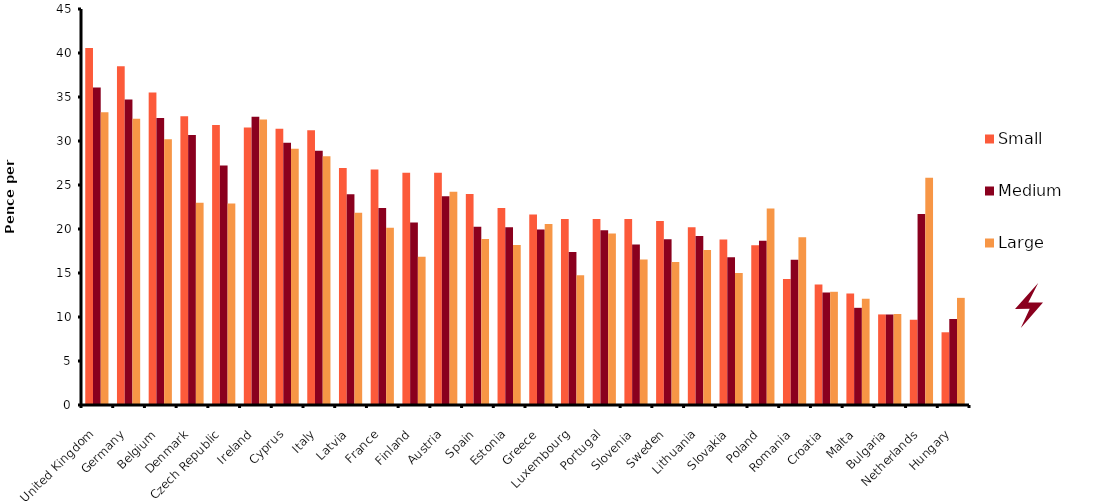
| Category | Small | Medium | Large |
|---|---|---|---|
| United Kingdom | 40.568 | 36.07 | 33.265 |
| Germany | 38.494 | 34.712 | 32.527 |
| Belgium | 35.497 | 32.622 | 30.187 |
| Denmark | 32.821 | 30.688 | 22.977 |
| Czech Republic | 31.819 | 27.208 | 22.891 |
| Ireland | 31.543 | 32.76 | 32.441 |
| Cyprus | 31.387 | 29.807 | 29.116 |
| Italy | 31.223 | 28.9 | 28.27 |
| Latvia | 26.923 | 23.953 | 21.846 |
| France | 26.75 | 22.373 | 20.145 |
| Finland | 26.388 | 20.749 | 16.846 |
| Austria | 26.379 | 23.728 | 24.246 |
| Spain | 23.97 | 20.266 | 18.85 |
| Estonia | 22.373 | 20.197 | 18.176 |
| Greece | 21.639 | 19.938 | 20.559 |
| Luxembourg | 21.138 | 17.399 | 14.731 |
| Portugal | 21.129 | 19.851 | 19.489 |
| Slovenia | 21.129 | 18.245 | 16.527 |
| Sweden | 20.905 | 18.832 | 16.259 |
| Lithuania | 20.197 | 19.195 | 17.606 |
| Slovakia | 18.806 | 16.777 | 15.007 |
| Poland | 18.15 | 18.668 | 22.321 |
| Romania | 14.325 | 16.492 | 19.074 |
| Croatia | 13.703 | 12.779 | 12.866 |
| Malta | 12.667 | 11.044 | 12.071 |
| Bulgaria | 10.293 | 10.293 | 10.336 |
| Netherlands | 9.68 | 21.716 | 25.826 |
| Hungary | 8.263 | 9.774 | 12.175 |